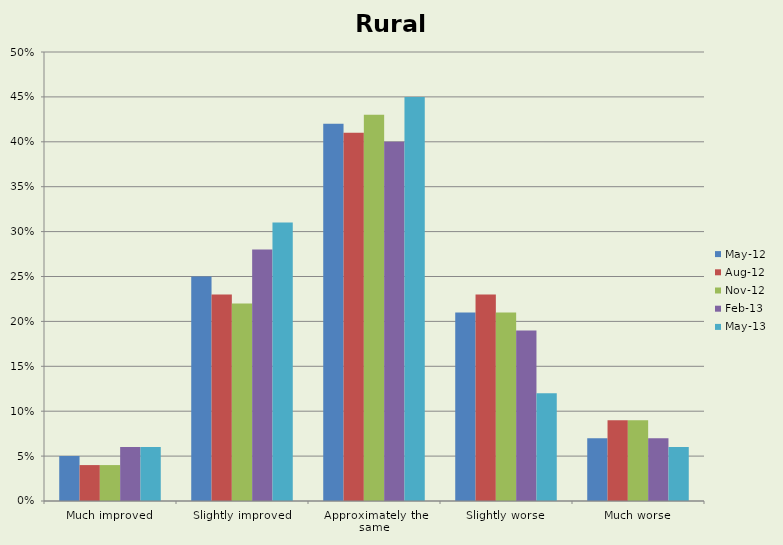
| Category | May-12 | Aug-12 | Nov-12 | Feb-13 | May-13 |
|---|---|---|---|---|---|
| Much improved | 0.05 | 0.04 | 0.04 | 0.06 | 0.06 |
| Slightly improved | 0.25 | 0.23 | 0.22 | 0.28 | 0.31 |
| Approximately the same | 0.42 | 0.41 | 0.43 | 0.4 | 0.45 |
| Slightly worse | 0.21 | 0.23 | 0.21 | 0.19 | 0.12 |
| Much worse | 0.07 | 0.09 | 0.09 | 0.07 | 0.06 |